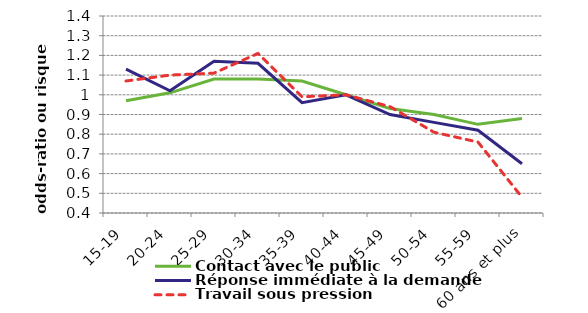
| Category | Contact avec le public | Réponse immédiate à la demande | Travail sous pression |
|---|---|---|---|
| 15-19 | 0.97 | 1.13 | 1.07 |
| 20-24 | 1.01 | 1.02 | 1.1 |
| 25-29 | 1.08 | 1.17 | 1.11 |
| 30-34 | 1.08 | 1.16 | 1.21 |
| 35-39 | 1.07 | 0.96 | 0.99 |
| 40-44 | 1 | 1 | 1 |
| 45-49 | 0.93 | 0.9 | 0.94 |
| 50-54 | 0.9 | 0.86 | 0.81 |
| 55-59 | 0.85 | 0.82 | 0.76 |
| 60 ans et plus | 0.88 | 0.65 | 0.48 |